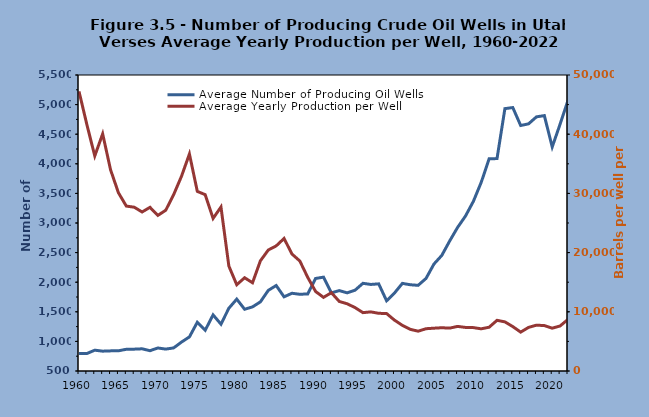
| Category | Average Number of Producing Oil Wells |
|---|---|
| 1960.0 | 796 |
| 1961.0 | 795 |
| 1962.0 | 852 |
| 1963.0 | 835 |
| 1964.0 | 840 |
| 1965.0 | 841 |
| 1966.0 | 867 |
| 1967.0 | 869 |
| 1968.0 | 875 |
| 1969.0 | 843 |
| 1970.0 | 889 |
| 1971.0 | 870 |
| 1972.0 | 890 |
| 1973.0 | 989 |
| 1974.0 | 1076 |
| 1975.0 | 1323 |
| 1976.0 | 1188 |
| 1977.0 | 1448 |
| 1978.0 | 1291 |
| 1979.0 | 1560 |
| 1980.0 | 1714 |
| 1981.0 | 1543 |
| 1982.0 | 1583 |
| 1983.0 | 1668 |
| 1984.0 | 1862 |
| 1985.0 | 1944 |
| 1986.0 | 1753 |
| 1987.0 | 1813 |
| 1988.0 | 1796 |
| 1989.0 | 1802 |
| 1990.0 | 2063 |
| 1991.0 | 2085 |
| 1992.0 | 1820 |
| 1993.0 | 1858 |
| 1994.0 | 1820 |
| 1995.0 | 1865 |
| 1996.0 | 1981 |
| 1997.0 | 1962 |
| 1998.0 | 1972 |
| 1999.0 | 1686 |
| 2000.0 | 1817 |
| 2001.0 | 1980 |
| 2002.0 | 1957 |
| 2003.0 | 1947 |
| 2004.0 | 2064 |
| 2005.0 | 2306 |
| 2006.0 | 2453 |
| 2007.0 | 2697 |
| 2008.0 | 2925 |
| 2009.0 | 3117 |
| 2010.0 | 3365 |
| 2011.0 | 3688 |
| 2012.0 | 4085 |
| 2013.0 | 4088 |
| 2014.0 | 4932 |
| 2015.0 | 4950 |
| 2016.0 | 4647 |
| 2017.0 | 4675 |
| 2018.0 | 4793 |
| 2019.0 | 4814 |
| 2020.0 | 4285 |
| 2021.0 | 4670 |
| 2022.0 | 5073 |